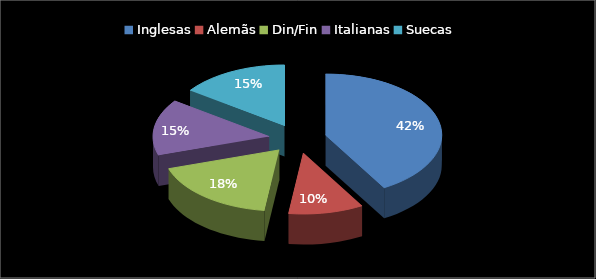
| Category | Series 0 |
|---|---|
| Inglesas | 0.416 |
| Alemãs | 0.104 |
| Din/Fin | 0.18 |
| Italianas | 0.149 |
| Suecas | 0.151 |